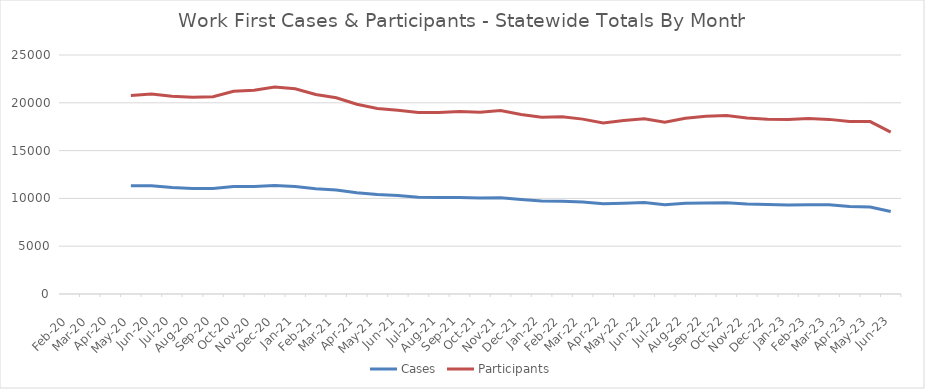
| Category | Cases | Participants |
|---|---|---|
| 2023-06-23 | 8626 | 16926 |
| 2023-05-23 | 9109 | 18037 |
| 2023-04-23 | 9158 | 18032 |
| 2023-03-23 | 9330 | 18266 |
| 2023-02-01 | 9348 | 18367 |
| 2023-01-01 | 9307 | 18258 |
| 2022-12-01 | 9357 | 18283 |
| 2022-11-22 | 9423 | 18412 |
| 2022-10-22 | 9547 | 18673 |
| 2022-09-22 | 9528 | 18586 |
| 2022-08-22 | 9505 | 18379 |
| 2022-07-22 | 9349 | 17973 |
| 2022-06-22 | 9561 | 18334 |
| 2022-05-22 | 9493 | 18139 |
| 2022-04-22 | 9434 | 17898 |
| 2022-03-22 | 9625 | 18293 |
| 2022-02-22 | 9713 | 18537 |
| 2022-01-22 | 9733 | 18484 |
| 2021-12-21 | 9885 | 18776 |
| 2021-11-21 | 10056 | 19192 |
| 2021-10-21 | 10034 | 19005 |
| 2021-09-21 | 10102 | 19085 |
| 2021-08-21 | 10090 | 18974 |
| 2021-07-21 | 10121 | 18988 |
| 2021-06-21 | 10298 | 19211 |
| 2021-05-21 | 10411 | 19413 |
| 2021-04-21 | 10601 | 19845 |
| 2021-03-21 | 10888 | 20521 |
| 2021-02-21 | 11007 | 20877 |
| 2021-01-21 | 11252 | 21466 |
| 2020-12-20 | 11350 | 21641 |
| 2020-11-20 | 11255 | 21305 |
| 2020-10-20 | 11243 | 21198 |
| 2020-09-20 | 11030 | 20626 |
| 2020-08-20 | 11034 | 20575 |
| 2020-07-20 | 11137 | 20693 |
| 2020-06-20 | 11320 | 20921 |
| 2020-05-20 | 11330 | 20766 |